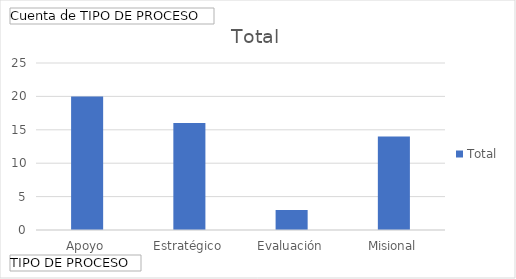
| Category | Total |
|---|---|
| Apoyo | 20 |
| Estratégico | 16 |
| Evaluación | 3 |
| Misional | 14 |